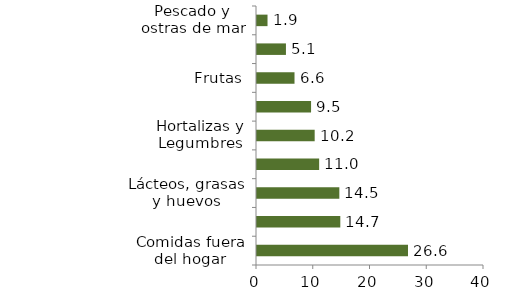
| Category | Alimentos |
|---|---|
| Comidas fuera del hogar | 26.608 |
| Carnes y derivados de la carne | 14.679 |
| Lácteos, grasas y huevos | 14.509 |
| Alimentos varios | 10.952 |
| Hortalizas y Legumbres | 10.164 |
| Cereales y productos de panadería | 9.526 |
| Frutas | 6.61 |
| Tubérculos y plátanos | 5.1 |
| Pescado y ostras de mar | 1.853 |